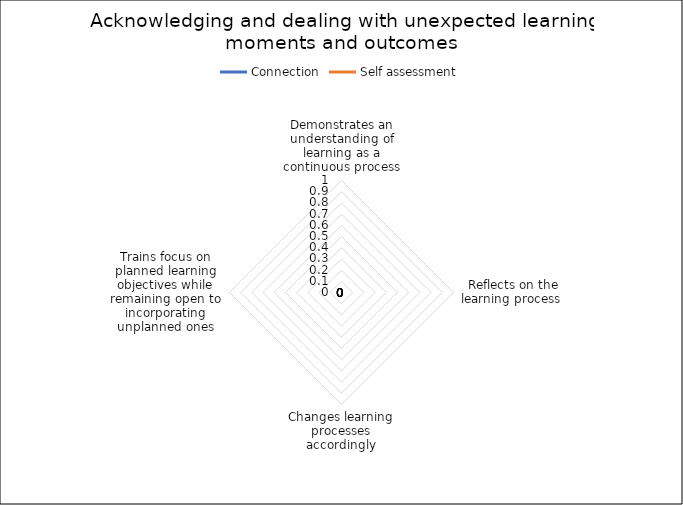
| Category | Connection | Self assessment |
|---|---|---|
| Demonstrates an understanding of learning as a continuous process | 0 | 0 |
| Reflects on the learning process  | 0 | 0 |
| Changes learning processes accordingly | 0 | 0 |
| Trains focus on planned learning objectives while remaining open to incorporating unplanned ones | 0 | 0 |